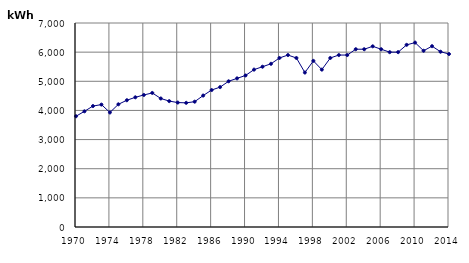
| Category | kWh |
|---|---|
| 1970 | 3800 |
| 1971 | 3970 |
| 1972 | 4150 |
| 1973 | 4200 |
| 1974 | 3930 |
| 1975 | 4210 |
| 1976 | 4350 |
| 1977 | 4450 |
| 1978 | 4530 |
| 1979 | 4600 |
| 1980 | 4410 |
| 1981 | 4320 |
| 1982 | 4270 |
| 1983 | 4260 |
| 1984 | 4300 |
| 1985 | 4510 |
| 1986 | 4700 |
| 1987 | 4800 |
| 1988 | 5000 |
| 1989 | 5100 |
| 1990 | 5200 |
| 1991 | 5400 |
| 1992 | 5500 |
| 1993 | 5600 |
| 1994 | 5800 |
| 1995 | 5900 |
| 1996 | 5800 |
| 1997 | 5300 |
| 1998 | 5700 |
| 1999 | 5400 |
| 2000 | 5800 |
| 2001 | 5900 |
| 2002 | 5900 |
| 2003 | 6100 |
| 2004 | 6100 |
| 2005 | 6200 |
| 2006 | 6100 |
| 2007 | 6000 |
| 2008 | 6000 |
| 2009 | 6249.909 |
| 2010 | 6326.873 |
| 2011 | 6047.482 |
| 2012 | 6204.612 |
| 2013 | 6014.448 |
| 2014 | 5935.345 |